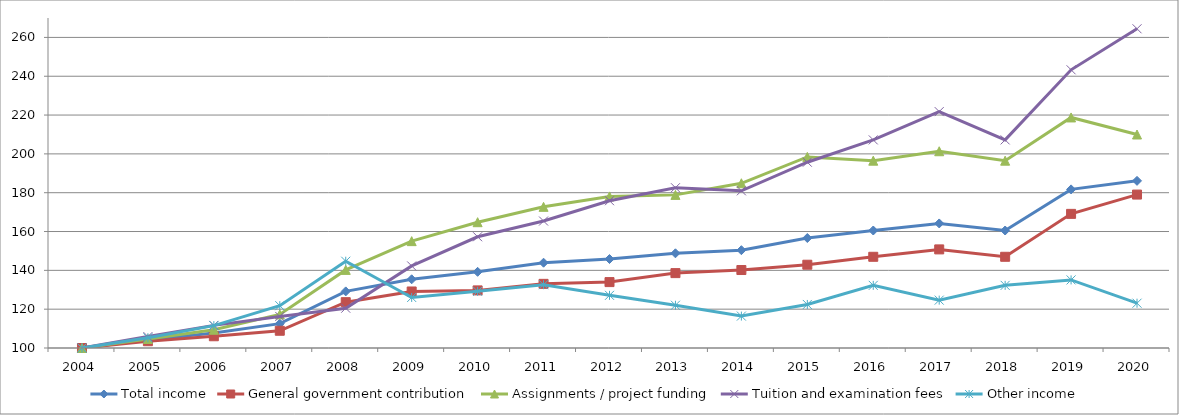
| Category | Total income | General government contribution | Assignments / project funding | Tuition and examination fees | Other income  |
|---|---|---|---|---|---|
| 2004.0 | 100 | 100 | 100 | 100 | 100 |
| 2005.0 | 104.092 | 103.499 | 104.629 | 105.881 | 105.274 |
| 2006.0 | 107.725 | 106.046 | 109.4 | 111.65 | 111.532 |
| 2007.0 | 112.54 | 108.881 | 117.297 | 116.238 | 121.792 |
| 2008.0 | 129.159 | 123.607 | 140.241 | 120.507 | 144.7 |
| 2009.0 | 135.394 | 129.117 | 155.052 | 142.268 | 126.04 |
| 2010.0 | 139.236 | 129.673 | 164.812 | 157.305 | 129.194 |
| 2011.0 | 143.936 | 133.048 | 172.718 | 165.412 | 132.613 |
| 2012.0 | 145.837 | 133.95 | 178.088 | 175.878 | 127.131 |
| 2013.0 | 148.786 | 138.576 | 178.882 | 182.576 | 122.028 |
| 2014.0 | 150.389 | 140.17 | 184.857 | 180.975 | 116.442 |
| 2015.0 | 156.657 | 142.9 | 198.435 | 195.707 | 122.426 |
| 2016.0 | 160.529 | 146.987 | 196.5 | 207.207 | 132.276 |
| 2017.0 | 164.164 | 150.797 | 201.356 | 221.776 | 124.656 |
| 2018.0 | 160.529 | 146.987 | 196.5 | 207.207 | 132.276 |
| 2019.0 | 181.715 | 169.102 | 218.77 | 243.315 | 135.073 |
| 2020.0 | 186.11 | 179.038 | 209.981 | 264.447 | 123.084 |